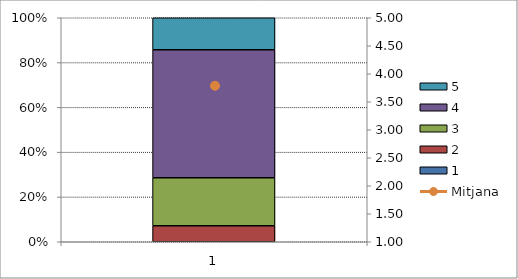
| Category | 1 | 2 | 3 | 4 | 5 |
|---|---|---|---|---|---|
| 0 | 0 | 1 | 3 | 8 | 2 |